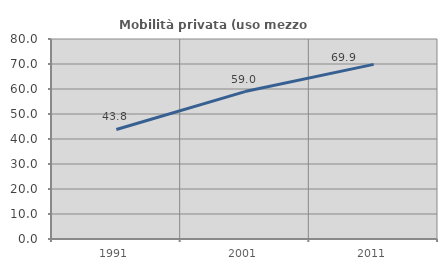
| Category | Mobilità privata (uso mezzo privato) |
|---|---|
| 1991.0 | 43.812 |
| 2001.0 | 58.973 |
| 2011.0 | 69.86 |